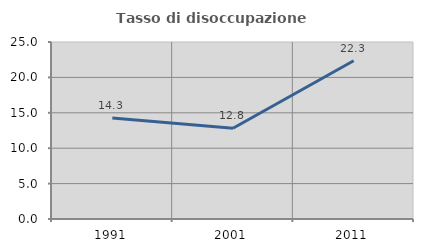
| Category | Tasso di disoccupazione giovanile  |
|---|---|
| 1991.0 | 14.257 |
| 2001.0 | 12.821 |
| 2011.0 | 22.344 |